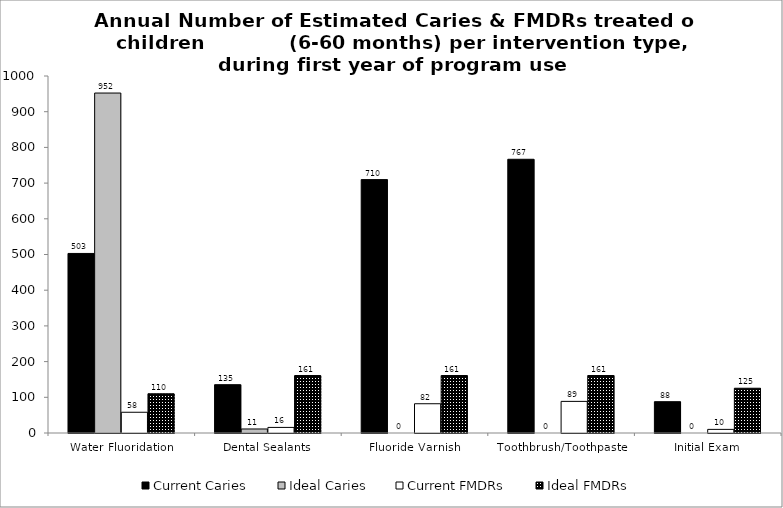
| Category | Current Caries | Ideal Caries | Current FMDRs | Ideal FMDRs |
|---|---|---|---|---|
| Water Fluoridation | 502.945 | 952.293 | 58.085 | 109.98 |
| Dental Sealants | 135.346 | 11.27 | 15.631 | 161 |
| Fluoride Varnish | 709.753 | 0 | 81.969 | 161 |
| Toothbrush/Toothpaste | 766.734 | 0 | 88.55 | 161 |
| Initial Exam | 87.704 | 0 | 10.129 | 125.361 |